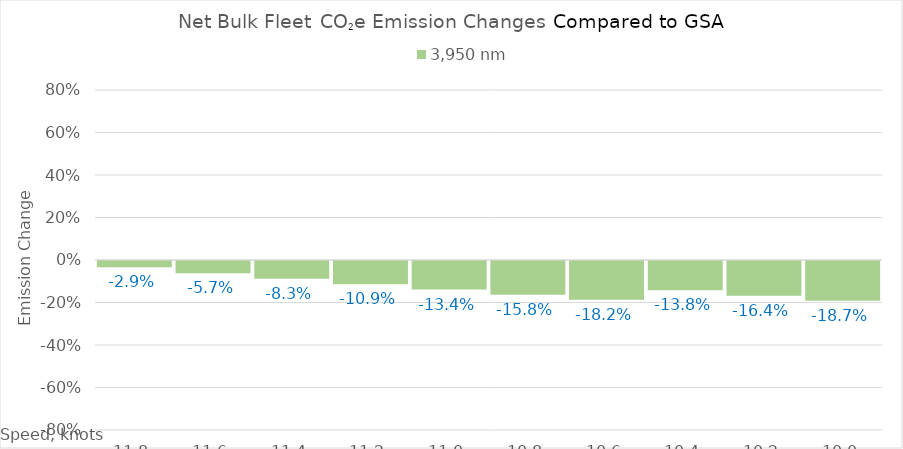
| Category | 3,950 |
|---|---|
| 11.8 | -0.029 |
| 11.600000000000001 | -0.057 |
| 11.400000000000002 | -0.083 |
| 11.200000000000003 | -0.109 |
| 11.000000000000004 | -0.134 |
| 10.800000000000004 | -0.158 |
| 10.600000000000005 | -0.182 |
| 10.400000000000006 | -0.138 |
| 10.200000000000006 | -0.164 |
| 10.000000000000007 | -0.187 |